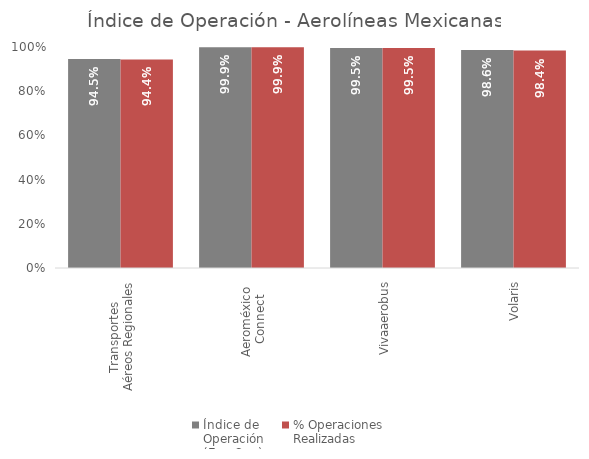
| Category | Índice de 
Operación
(Ene-Sep) | % Operaciones
Realizadas |
|---|---|---|
| Transportes 
Aéreos Regionales | 0.945 | 0.944 |
| Aeroméxico 
Connect | 0.999 | 0.999 |
| Vivaaerobus | 0.995 | 0.995 |
| Volaris | 0.986 | 0.984 |